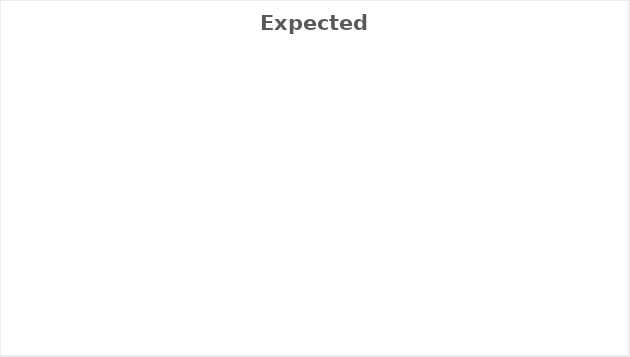
| Category | Series 0 |
|---|---|
| Rent | 0 |
| Car Insurance | 0 |
| Health Care | 0 |
| Grocery | 0 |
| Eating Out | 0 |
| Misc Impulse | 0 |
| Gas | 0 |
| Utilities | 0 |